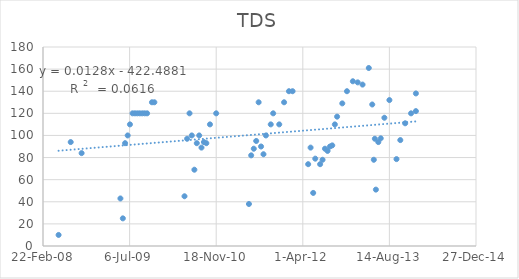
| Category | Series 0 |
|---|---|
| 39590.0 | 10 |
| 39660.0 | 94 |
| 39723.0 | 84 |
| 39947.0 | 43 |
| 39961.0 | 25 |
| 39974.0 | 93 |
| 39989.0 | 100 |
| 40002.0 | 110 |
| 40017.0 | 120 |
| 40031.0 | 120 |
| 40045.0 | 120 |
| 40059.0 | 120 |
| 40073.0 | 120 |
| 40087.0 | 120 |
| 40101.0 | 120 |
| 40129.0 | 130 |
| 40143.0 | 130 |
| 40317.0 | 45 |
| 40332.0 | 97 |
| 40346.0 | 120 |
| 40359.0 | 100 |
| 40374.0 | 69 |
| 40388.0 | 93 |
| 40402.0 | 100 |
| 40415.0 | 89 |
| 40429.0 | 94 |
| 40443.0 | 93 |
| 40464.0 | 110 |
| 40500.0 | 120 |
| 40689.0 | 38 |
| 40702.0 | 82 |
| 40717.0 | 88 |
| 40731.0 | 95 |
| 40745.0 | 130 |
| 40759.0 | 90 |
| 40773.0 | 83 |
| 40787.0 | 100 |
| 40815.0 | 110 |
| 40829.0 | 120 |
| 40864.0 | 110 |
| 40892.0 | 130 |
| 40920.0 | 140 |
| 40941.0 | 140 |
| 41031.0 | 74 |
| 41045.0 | 89 |
| 41060.0 | 48 |
| 41072.0 | 79 |
| 41100.0 | 74 |
| 41114.0 | 78 |
| 41128.0 | 88 |
| 41143.0 | 86 |
| 41157.0 | 90 |
| 41170.0 | 91 |
| 41185.0 | 110 |
| 41198.0 | 117 |
| 41228.0 | 129 |
| 41255.0 | 140 |
| 41289.0 | 149 |
| 41317.0 | 148 |
| 41345.0 | 146 |
| 41381.0 | 161 |
| 41401.0 | 128 |
| 41410.0 | 78 |
| 41416.0 | 97 |
| 41422.0 | 51 |
| 41436.0 | 94 |
| 41450.0 | 97.4 |
| 41471.0 | 116 |
| 41500.0 | 132 |
| 41541.0 | 78.6 |
| 41563.0 | 95.8 |
| 41591.0 | 111 |
| 41625.0 | 120 |
| 41653.0 | 138 |
| 41653.0 | 122 |